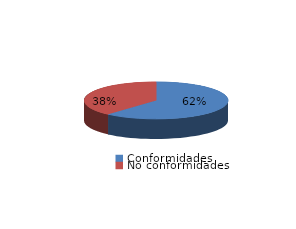
| Category | Series 0 |
|---|---|
| Conformidades | 667 |
| No conformidades | 417 |